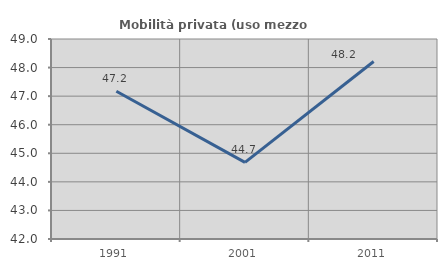
| Category | Mobilità privata (uso mezzo privato) |
|---|---|
| 1991.0 | 47.17 |
| 2001.0 | 44.681 |
| 2011.0 | 48.214 |